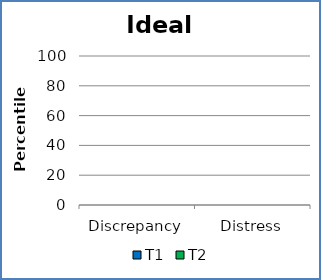
| Category | T1 | T2 |
|---|---|---|
| Discrepancy | 0 | 0 |
| Distress | 0 | 0 |